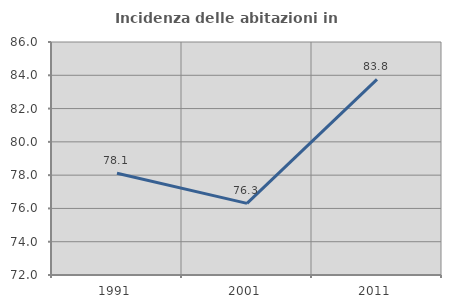
| Category | Incidenza delle abitazioni in proprietà  |
|---|---|
| 1991.0 | 78.112 |
| 2001.0 | 76.305 |
| 2011.0 | 83.75 |